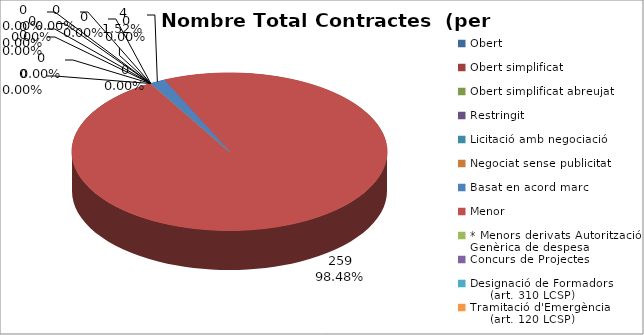
| Category | Nombre Total Contractes |
|---|---|
| Obert | 0 |
| Obert simplificat | 0 |
| Obert simplificat abreujat | 0 |
| Restringit | 0 |
| Licitació amb negociació | 0 |
| Negociat sense publicitat | 0 |
| Basat en acord marc | 4 |
| Menor | 259 |
| * Menors derivats Autorització Genèrica de despesa | 0 |
| Concurs de Projectes | 0 |
| Designació de Formadors
     (art. 310 LCSP) | 0 |
| Tramitació d'Emergència
     (art. 120 LCSP) | 0 |